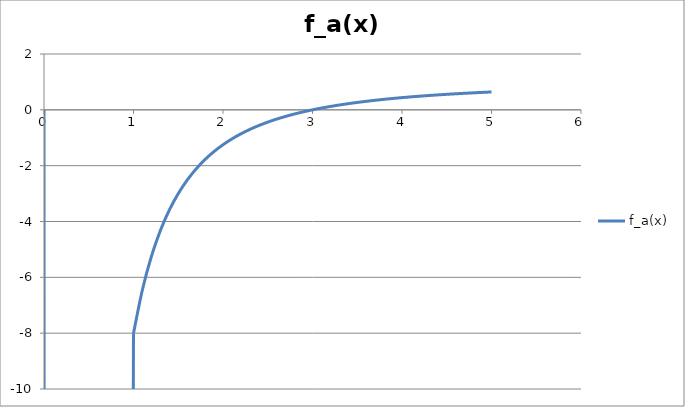
| Category | f_a(x) |
|---|---|
| 0.0 | 0 |
| 0.1 | -899 |
| 0.2 | -224 |
| 0.3 | -99 |
| 0.4 | -55.25 |
| 0.5 | -35 |
| 0.6 | -24 |
| 0.7 | -17.367 |
| 0.8 | -13.062 |
| 0.9 | -10.111 |
| 1.0 | -8 |
| 1.1 | -6.438 |
| 1.2 | -5.25 |
| 1.3 | -4.325 |
| 1.4 | -3.592 |
| 1.5 | -3 |
| 1.6 | -2.516 |
| 1.7 | -2.114 |
| 1.8 | -1.778 |
| 1.9 | -1.493 |
| 2.0 | -1.25 |
| 2.1 | -1.041 |
| 2.2 | -0.86 |
| 2.3 | -0.701 |
| 2.4 | -0.562 |
| 2.5 | -0.44 |
| 2.6 | -0.331 |
| 2.7 | -0.235 |
| 2.8 | -0.148 |
| 2.9 | -0.07 |
| 3.0 | 0 |
| 3.1 | 0.063 |
| 3.2 | 0.121 |
| 3.3 | 0.174 |
| 3.4 | 0.221 |
| 3.5 | 0.265 |
| 3.6 | 0.306 |
| 3.7 | 0.343 |
| 3.8 | 0.377 |
| 3.9 | 0.408 |
| 4.0 | 0.438 |
| 4.1 | 0.465 |
| 4.2 | 0.49 |
| 4.3 | 0.513 |
| 4.4 | 0.535 |
| 4.5 | 0.556 |
| 4.6 | 0.575 |
| 4.7 | 0.593 |
| 4.8 | 0.609 |
| 4.9 | 0.625 |
| 5.0 | 0.64 |